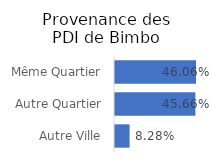
| Category | Provenance des PDI |
|---|---|
| Autre Ville | 0.083 |
| Autre Quartier | 0.457 |
| Même Quartier | 0.461 |